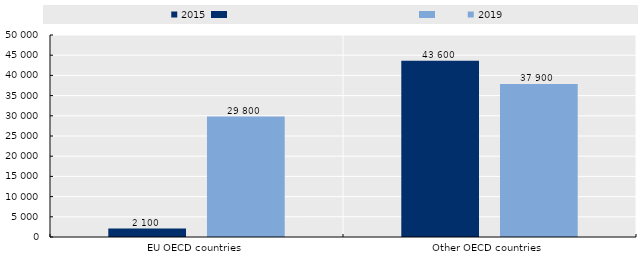
| Category | 2015 | 2019 |
|---|---|---|
| EU OECD countries | 2100 | 29800 |
| Other OECD countries | 43600 | 37900 |